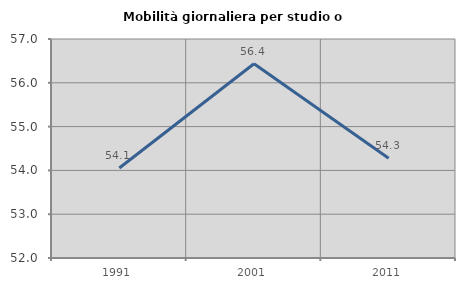
| Category | Mobilità giornaliera per studio o lavoro |
|---|---|
| 1991.0 | 54.054 |
| 2001.0 | 56.436 |
| 2011.0 | 54.276 |